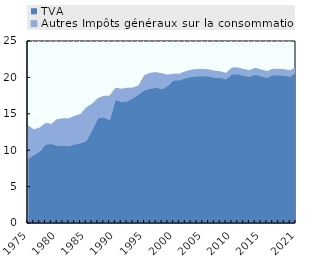
| Category | TVA | Autres Impôts généraux sur la consommation |
|---|---|---|
| 1975.0 | 8.832 | 4.527 |
| nan | 9.376 | 3.421 |
| nan | 9.834 | 3.218 |
| nan | 10.807 | 2.874 |
| nan | 10.898 | 2.658 |
| 1980.0 | 10.674 | 3.53 |
| nan | 10.683 | 3.622 |
| nan | 10.606 | 3.703 |
| nan | 10.844 | 3.826 |
| nan | 10.992 | 3.901 |
| 1985.0 | 11.308 | 4.52 |
| nan | 12.822 | 3.501 |
| nan | 14.436 | 2.656 |
| nan | 14.574 | 2.836 |
| nan | 14.144 | 3.273 |
| 1990.0 | 16.976 | 1.522 |
| nan | 16.702 | 1.683 |
| nan | 16.755 | 1.745 |
| nan | 17.155 | 1.387 |
| nan | 17.727 | 1.126 |
| 1995.0 | 18.265 | 1.987 |
| nan | 18.499 | 2.082 |
| nan | 18.63 | 2.018 |
| nan | 18.441 | 2.049 |
| nan | 18.875 | 1.435 |
| 2000.0 | 19.632 | 0.832 |
| nan | 19.64 | 0.803 |
| nan | 19.941 | 0.837 |
| nan | 20.121 | 0.863 |
| nan | 20.188 | 0.906 |
| 2005.0 | 20.222 | 0.883 |
| nan | 20.186 | 0.847 |
| nan | 19.996 | 0.869 |
| nan | 20.004 | 0.759 |
| nan | 19.781 | 0.778 |
| 2010.0 | 20.469 | 0.833 |
| nan | 20.473 | 0.826 |
| nan | 20.271 | 0.817 |
| nan | 20.136 | 0.816 |
| nan | 20.414 | 0.836 |
| 2015.0 | 20.201 | 0.817 |
| nan | 19.997 | 0.818 |
| nan | 20.337 | 0.772 |
| nan | 20.323 | 0.781 |
| nan | 20.309 | 0.749 |
| nan | 20.162 | 0.747 |
| 2021.0 | 20.681 | 0.7 |